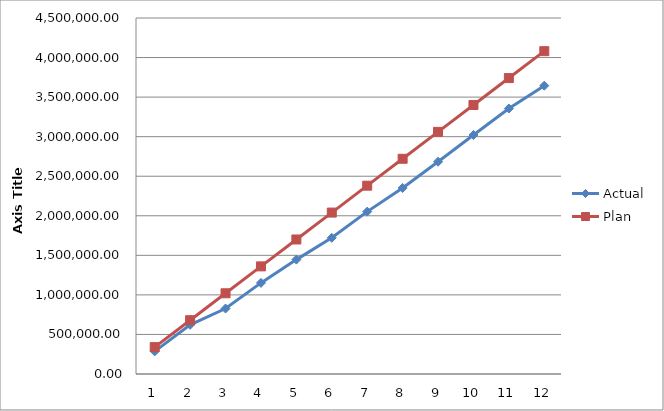
| Category | Actual | Plan |
|---|---|---|
| 0 | 286289.75 | 340069 |
| 1 | 621661.8 | 680138 |
| 2 | 827621.26 | 1020207 |
| 3 | 1151451.19 | 1360276 |
| 4 | 1446007.47 | 1700345 |
| 5 | 1721351.86 | 2040414 |
| 6 | 2052642.3 | 2380483 |
| 7 | 2351594.54 | 2720552 |
| 8 | 2683226.31 | 3060621 |
| 9 | 3021130.57 | 3400690 |
| 10 | 3355694.28 | 3740759 |
| 11 | 3644103.38 | 4080828 |